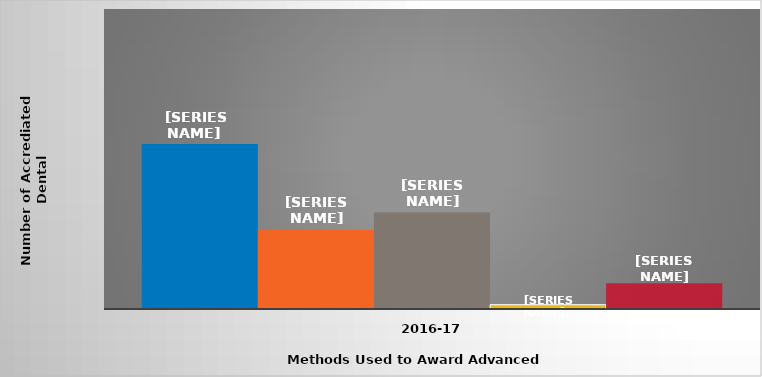
| Category | Transfer of credit | Equivalency examinations | Challenge examinations | Completion of non-accredited dental assisting program at institution | Other |
|---|---|---|---|---|---|
| 2016-17 | 77 | 37 | 45 | 2 | 12 |